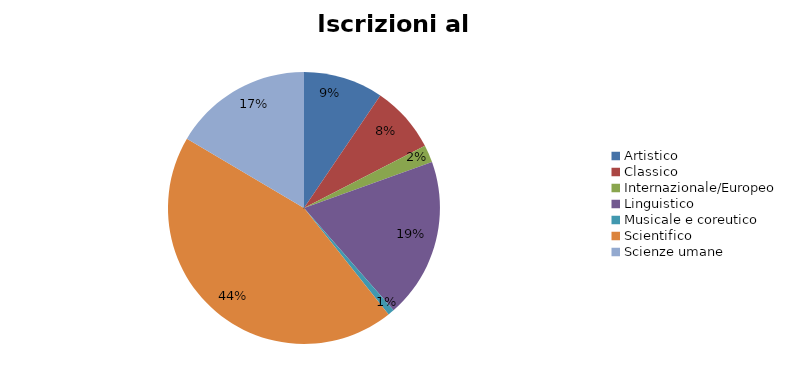
| Category | Series 0 | Series 1 |
|---|---|---|
| Artistico | 1704 |  |
| Classico | 1429 |  |
| Internazionale/Europeo | 375 |  |
| Linguistico | 3421 |  |
| Musicale e coreutico | 137 |  |
| Scientifico | 7938 |  |
| Scienze umane | 2966 |  |